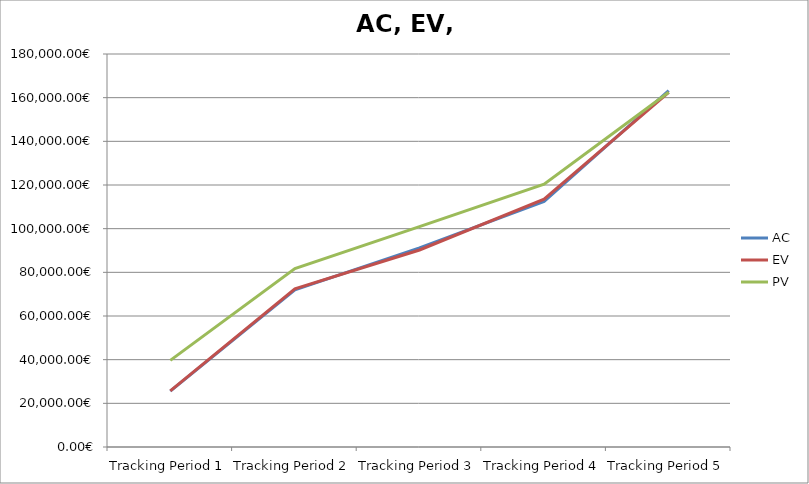
| Category | AC | EV | PV |
|---|---|---|---|
| Tracking Period 1 | 25566 | 25706 | 39674 |
| Tracking Period 2 | 71965 | 72448 | 81700 |
| Tracking Period 3 | 91166 | 90243 | 100936 |
| Tracking Period 4 | 112485 | 113475 | 120366 |
| Tracking Period 5 | 163189 | 162472 | 162472 |